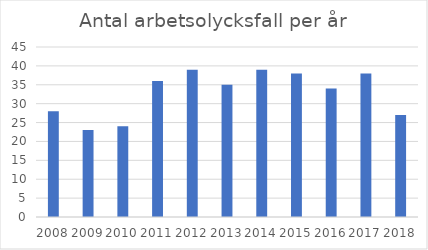
| Category | Antal arbetsolycksfall |
|---|---|
| 2008.0 | 28 |
| 2009.0 | 23 |
| 2010.0 | 24 |
| 2011.0 | 36 |
| 2012.0 | 39 |
| 2013.0 | 35 |
| 2014.0 | 39 |
| 2015.0 | 38 |
| 2016.0 | 34 |
| 2017.0 | 38 |
| 2018.0 | 27 |